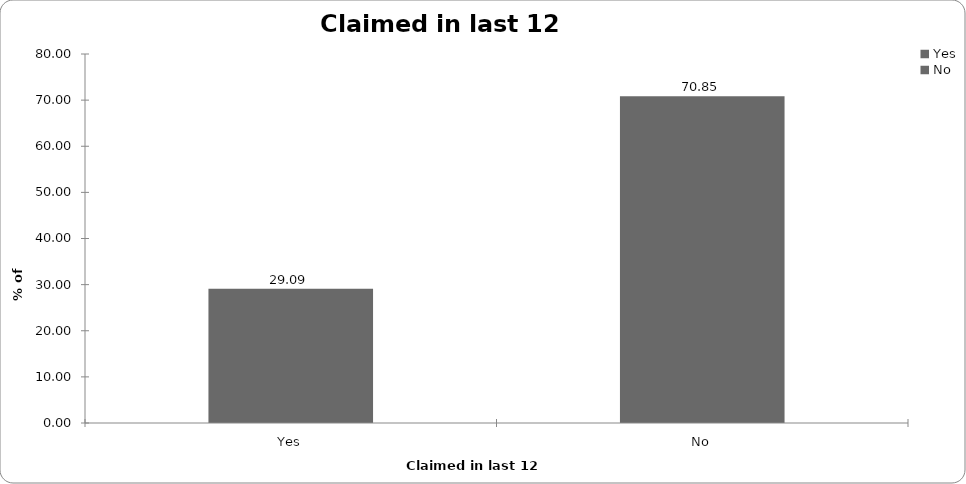
| Category | Claimed in last 12 months |
|---|---|
| Yes | 29.086 |
| No | 70.847 |